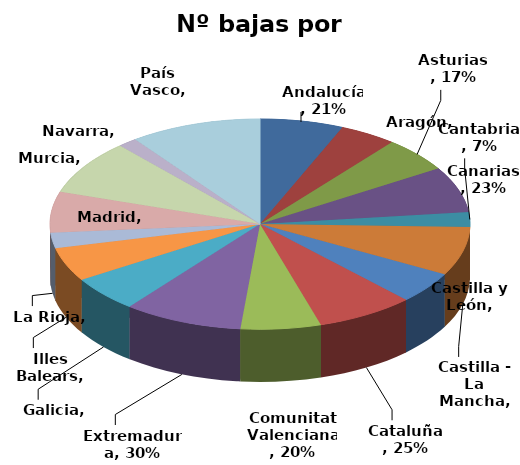
| Category | Nº bajas por enfermedad |
|---|---|
| Andalucía | 0.209 |
| Aragón | 0.143 |
| Asturias | 0.173 |
| Canarias | 0.23 |
| Cantabria | 0.074 |
| Castilla - La Mancha | 0.244 |
| Castilla y León | 0.157 |
| Cataluña | 0.246 |
| Comunitat Valenciana | 0.201 |
| Extremadura | 0.298 |
| Galicia | 0.178 |
| Illes Balears | 0.169 |
| La Rioja | 0.077 |
| Madrid | 0.205 |
| Murcia | 0.274 |
| Navarra | 0.048 |
| País Vasco | 0.33 |